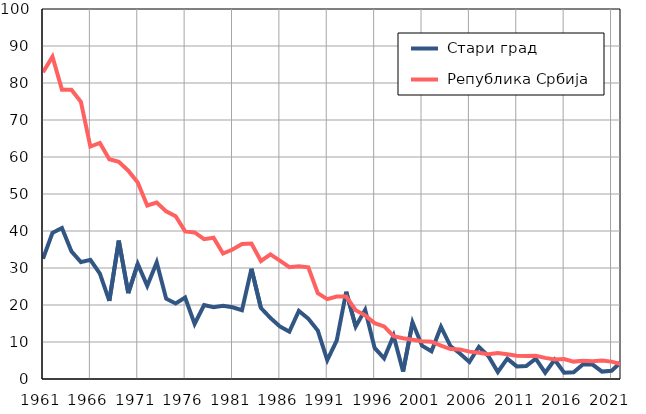
| Category |  Стари град |  Република Србија |
|---|---|---|
| 1961.0 | 32.5 | 82.9 |
| 1962.0 | 39.5 | 87.1 |
| 1963.0 | 40.8 | 78.2 |
| 1964.0 | 34.5 | 78.2 |
| 1965.0 | 31.6 | 74.9 |
| 1966.0 | 32.2 | 62.8 |
| 1967.0 | 28.5 | 63.8 |
| 1968.0 | 21.1 | 59.4 |
| 1969.0 | 37.4 | 58.7 |
| 1970.0 | 23.2 | 56.3 |
| 1971.0 | 31.1 | 53.1 |
| 1972.0 | 25.2 | 46.9 |
| 1973.0 | 31.5 | 47.7 |
| 1974.0 | 21.7 | 45.3 |
| 1975.0 | 20.4 | 44 |
| 1976.0 | 22 | 39.9 |
| 1977.0 | 14.9 | 39.6 |
| 1978.0 | 20 | 37.8 |
| 1979.0 | 19.4 | 38.2 |
| 1980.0 | 19.8 | 33.9 |
| 1981.0 | 19.4 | 35 |
| 1982.0 | 18.6 | 36.5 |
| 1983.0 | 29.8 | 36.6 |
| 1984.0 | 19.2 | 31.9 |
| 1985.0 | 16.5 | 33.7 |
| 1986.0 | 14.2 | 32 |
| 1987.0 | 12.8 | 30.2 |
| 1988.0 | 18.4 | 30.5 |
| 1989.0 | 16.3 | 30.2 |
| 1990.0 | 13.1 | 23.2 |
| 1991.0 | 5.1 | 21.6 |
| 1992.0 | 10.4 | 22.3 |
| 1993.0 | 23.6 | 22.3 |
| 1994.0 | 14.2 | 18.6 |
| 1995.0 | 18.7 | 17.2 |
| 1996.0 | 8.4 | 15.1 |
| 1997.0 | 5.6 | 14.2 |
| 1998.0 | 11.7 | 11.6 |
| 1999.0 | 2 | 11 |
| 2000.0 | 15.3 | 10.6 |
| 2001.0 | 9 | 10.2 |
| 2002.0 | 7.5 | 10.1 |
| 2003.0 | 14.1 | 9 |
| 2004.0 | 8.9 | 8.1 |
| 2005.0 | 6.9 | 8 |
| 2006.0 | 4.6 | 7.4 |
| 2007.0 | 8.7 | 7.1 |
| 2008.0 | 6.2 | 6.7 |
| 2009.0 | 1.9 | 7 |
| 2010.0 | 5.5 | 6.7 |
| 2011.0 | 3.4 | 6.3 |
| 2012.0 | 3.5 | 6.2 |
| 2013.0 | 5.5 | 6.3 |
| 2014.0 | 1.7 | 5.7 |
| 2015.0 | 5.2 | 5.3 |
| 2016.0 | 1.7 | 5.4 |
| 2017.0 | 1.8 | 4.7 |
| 2018.0 | 4 | 4.9 |
| 2019.0 | 3.9 | 4.8 |
| 2020.0 | 2 | 5 |
| 2021.0 | 2.2 | 4.7 |
| 2022.0 | 4.6 | 4 |